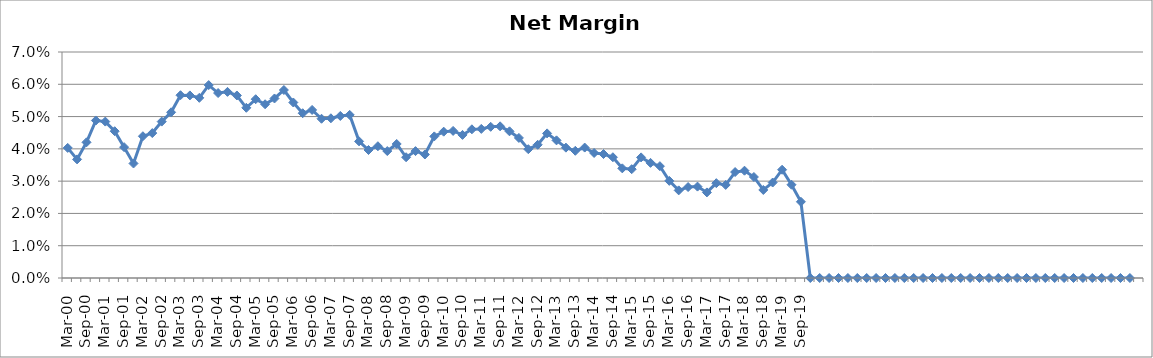
| Category | Series 0 |
|---|---|
| Mar-00 | 0.04 |
| Jun-00 | 0.037 |
| Sep-00 | 0.042 |
| Dec-00 | 0.049 |
| Mar-01 | 0.048 |
| Jun-01 | 0.045 |
| Sep-01 | 0.041 |
| Dec-01 | 0.035 |
| Mar-02 | 0.044 |
| Jun-02 | 0.045 |
| Sep-02 | 0.048 |
| Dec-02 | 0.051 |
| Mar-03 | 0.057 |
| Jun-03 | 0.057 |
| Sep-03 | 0.056 |
| Dec-03 | 0.06 |
| Mar-04 | 0.057 |
| Jun-04 | 0.058 |
| Sep-04 | 0.057 |
| Dec-04 | 0.053 |
| Mar-05 | 0.055 |
| Jun-05 | 0.054 |
| Sep-05 | 0.056 |
| Dec-05 | 0.058 |
| Mar-06 | 0.054 |
| Jun-06 | 0.051 |
| Sep-06 | 0.052 |
| Dec-06 | 0.049 |
| Mar-07 | 0.049 |
| Jun-07 | 0.05 |
| Sep-07 | 0.051 |
| Dec-07 | 0.042 |
| Mar-08 | 0.04 |
| Jun-08 | 0.041 |
| Sep-08 | 0.039 |
| Dec-08 | 0.042 |
| Mar-09 | 0.037 |
| Jun-09 | 0.039 |
| Sep-09 | 0.038 |
| Dec-09 | 0.044 |
| Mar-10 | 0.045 |
| Jun-10 | 0.046 |
| Sep-10 | 0.044 |
| Dec-10 | 0.046 |
| Mar-11 | 0.046 |
| Jun-11 | 0.047 |
| Sep-11 | 0.047 |
| Dec-11 | 0.045 |
| Mar-12 | 0.043 |
| Jun-12 | 0.04 |
| Sep-12 | 0.041 |
| Dec-12 | 0.045 |
| Mar-13 | 0.043 |
| Jun-13 | 0.04 |
| Sep-13 | 0.039 |
| Dec-13 | 0.04 |
| Mar-14 | 0.039 |
| Jun-14 | 0.038 |
| Sep-14 | 0.037 |
| Dec-14 | 0.034 |
| Mar-15 | 0.034 |
| Jun-15 | 0.037 |
| Sep-15 | 0.036 |
| Dec-15 | 0.035 |
| Mar-16 | 0.03 |
| Jun-16 | 0.027 |
| Sep-16 | 0.028 |
| Dec-16 | 0.028 |
| Mar-17 | 0.027 |
| Jun-17 | 0.029 |
| Sep-17 | 0.029 |
| Dec-17 | 0.033 |
| Mar-18 | 0.033 |
| Jun-18 | 0.031 |
| Sep-18 | 0.027 |
| Dec-18 | 0.03 |
| Mar-19 | 0.034 |
| Jun-19 | 0.029 |
| Sep-19 | 0.024 |